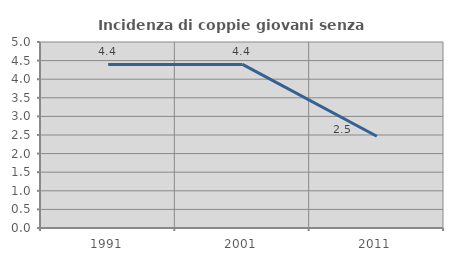
| Category | Incidenza di coppie giovani senza figli |
|---|---|
| 1991.0 | 4.396 |
| 2001.0 | 4.398 |
| 2011.0 | 2.466 |